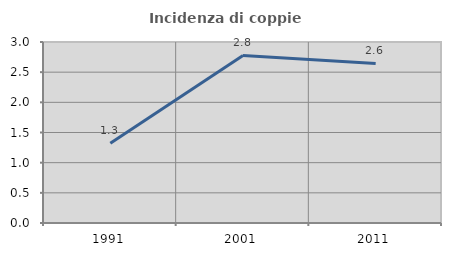
| Category | Incidenza di coppie miste |
|---|---|
| 1991.0 | 1.322 |
| 2001.0 | 2.778 |
| 2011.0 | 2.646 |